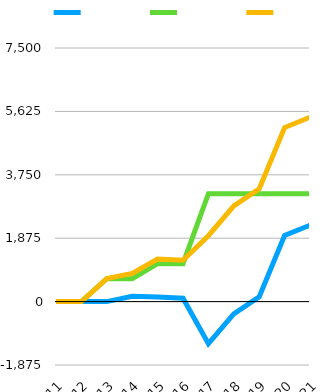
| Category | Series 0 | Series 1 | Series 2 |
|---|---|---|---|
| 2011 | 0 | -0.571 | -0.571 |
| 2012 | 0 | -0.571 | -0.571 |
| 2013 | 0 | 678.962 | 678.962 |
| 2014 | 157.274 | 678.962 | 836.236 |
| 2015 | 135.184 | 1124.44 | 1259.624 |
| 2016 | 101.72 | 1121.449 | 1223.169 |
| 2017 | -1245.112 | 3193.128 | 1948.016 |
| 2018 | -365.425 | 3193.128 | 2827.703 |
| 2019 | 138.412 | 3193.128 | 3331.54 |
| 2020 | 1954.112 | 3193.128 | 5147.24 |
| 2021 | 2258.892 | 3193.128 | 5452.02 |